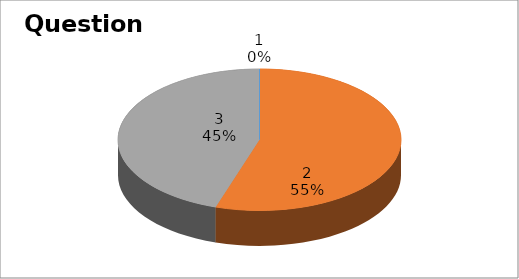
| Category | Series 0 |
|---|---|
| 0 | 0 |
| 1 | 11 |
| 2 | 9 |